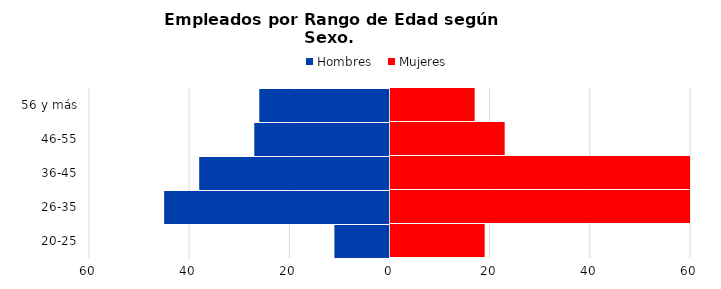
| Category | Hombres | Mujeres |
|---|---|---|
| 20-25 | -11 | 19 |
| 26-35 | -45 | 82 |
| 36-45 | -38 | 72 |
| 46-55 | -27 | 23 |
| 56 y más | -26 | 17 |